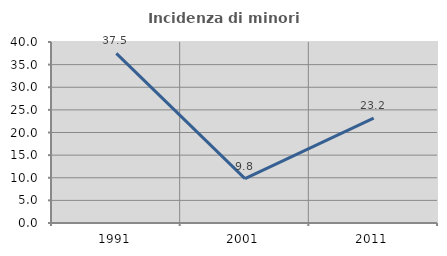
| Category | Incidenza di minori stranieri |
|---|---|
| 1991.0 | 37.5 |
| 2001.0 | 9.804 |
| 2011.0 | 23.196 |